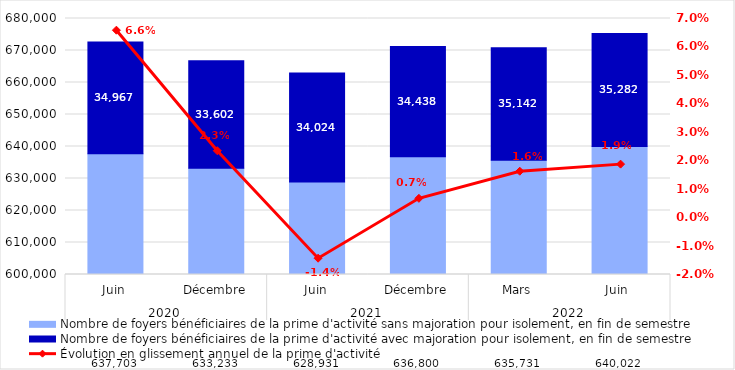
| Category | Nombre de foyers bénéficiaires de la prime d'activité sans majoration pour isolement, en fin de semestre | Nombre de foyers bénéficiaires de la prime d'activité avec majoration pour isolement, en fin de semestre |
|---|---|---|
| 0 | 637703 | 34967 |
| 1 | 633233 | 33602 |
| 2 | 628931 | 34024 |
| 3 | 636800 | 34438 |
| 4 | 635731 | 35142 |
| 5 | 640022 | 35282 |